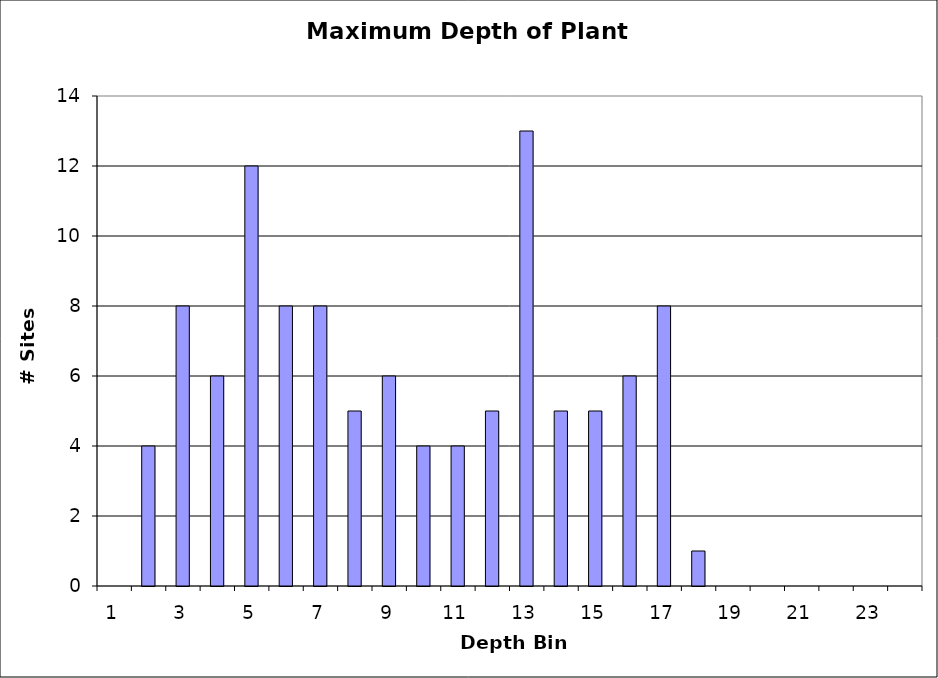
| Category | Series 0 |
|---|---|
| 1.0 | 0 |
| 2.0 | 4 |
| 3.0 | 8 |
| 4.0 | 6 |
| 5.0 | 12 |
| 6.0 | 8 |
| 7.0 | 8 |
| 8.0 | 5 |
| 9.0 | 6 |
| 10.0 | 4 |
| 11.0 | 4 |
| 12.0 | 5 |
| 13.0 | 13 |
| 14.0 | 5 |
| 15.0 | 5 |
| 16.0 | 6 |
| 17.0 | 8 |
| 18.0 | 1 |
| 19.0 | 0 |
| 20.0 | 0 |
| 21.0 | 0 |
| 22.0 | 0 |
| 23.0 | 0 |
| 24.0 | 0 |